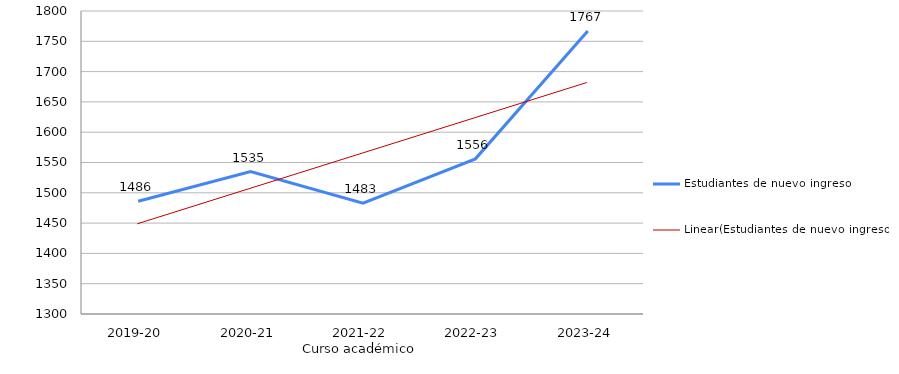
| Category | Estudiantes de nuevo ingreso |
|---|---|
| 2019-20 | 1486 |
| 2020-21 | 1535 |
| 2021-22 | 1483 |
| 2022-23 | 1556 |
| 2023-24 | 1767 |